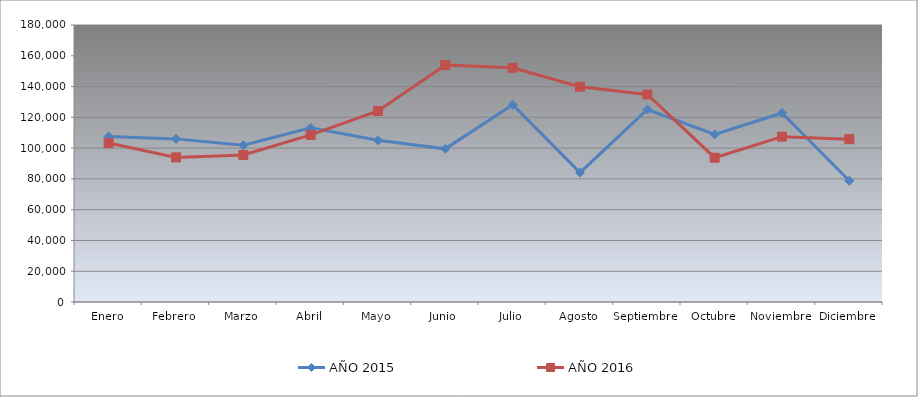
| Category | AÑO 2015 | AÑO 2016 |
|---|---|---|
| Enero | 107580 | 103275 |
| Febrero | 106000 | 93970 |
| Marzo | 101850 | 95540 |
| Abril | 113140 | 108610 |
| Mayo | 105070 | 124110 |
| Junio | 99530 | 153980 |
| Julio | 128150 | 152210 |
| Agosto | 84080 | 139890 |
| Septiembre | 125090 | 134840 |
| Octubre | 108925 | 93770 |
| Noviembre | 122820 | 107430 |
| Diciembre | 78770 | 105830 |